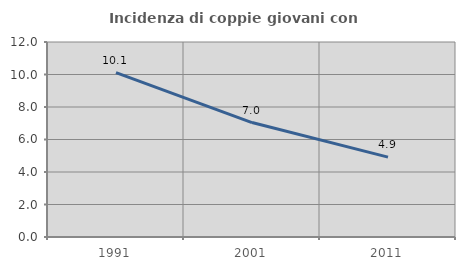
| Category | Incidenza di coppie giovani con figli |
|---|---|
| 1991.0 | 10.112 |
| 2001.0 | 7.042 |
| 2011.0 | 4.918 |